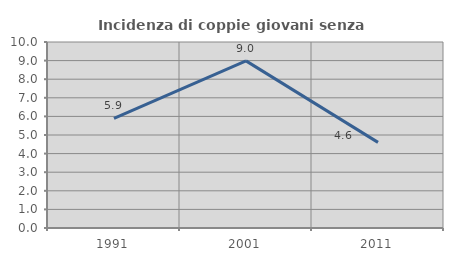
| Category | Incidenza di coppie giovani senza figli |
|---|---|
| 1991.0 | 5.89 |
| 2001.0 | 8.987 |
| 2011.0 | 4.605 |